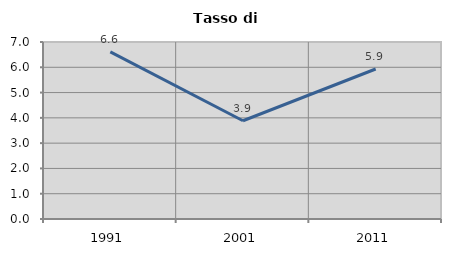
| Category | Tasso di disoccupazione   |
|---|---|
| 1991.0 | 6.608 |
| 2001.0 | 3.885 |
| 2011.0 | 5.932 |